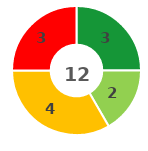
| Category | Series 0 |
|---|---|
| 0 | 3 |
| 1 | 2 |
| 2 | 4 |
| 3 | 3 |
| 4 | 0 |